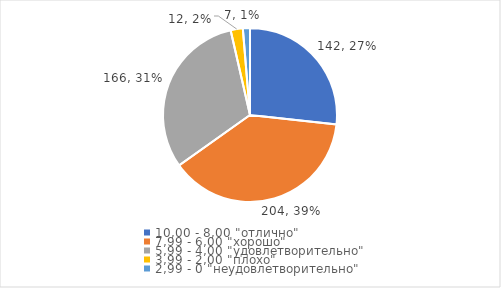
| Category | Series 0 | Series 1 |
|---|---|---|
| 10,00 - 8,00 "отлично" | 142 | 0.267 |
| 7,99 - 6,00 "хорошо" | 204 | 0.384 |
| 5,99 - 4,00 "удовлетворительно" | 166 | 0.313 |
| 3,99 - 2,00 "плохо" | 12 | 0.023 |
| 2,99 - 0 "неудовлетворительно" | 7 | 0.013 |